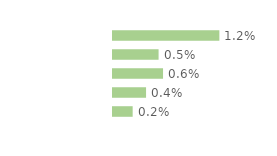
| Category | Series 0 |
|---|---|
| 18-29 ans | 0.012 |
| 30-39 ans | 0.005 |
| 40-49 ans | 0.006 |
| 50-59 ans | 0.004 |
| 60-75 ans | 0.002 |